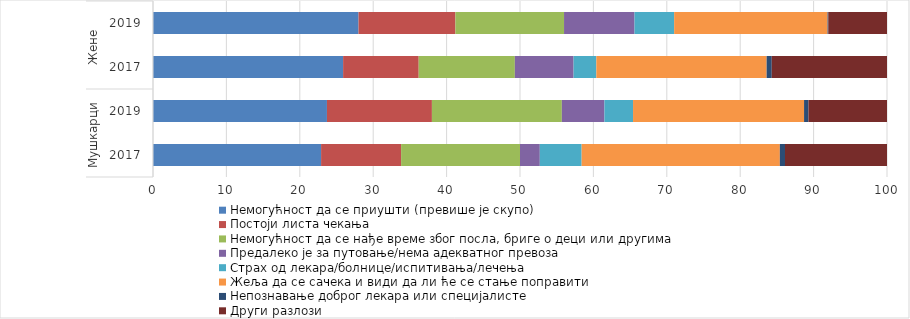
| Category | Немогућност да се приушти (превише је скупо) | Постоји листа чекања | Немогућност да се нађе време због посла, бриге о деци или другима | Предалеко је за путовање/нема адекватног превоза | Страх од лекара/болнице/испитивања/лечења | Жеља да се сачека и види да ли ће се стање поправити | Непознавање доброг лекара или специјалисте | Други разлози |
|---|---|---|---|---|---|---|---|---|
| 0 | 22.9 | 10.9 | 16.2 | 2.7 | 5.7 | 27 | 0.7 | 13.9 |
| 1 | 23.7 | 14.3 | 17.7 | 5.8 | 3.9 | 23.3 | 0.6 | 10.7 |
| 2 | 25.9 | 10.3 | 13.1 | 8 | 3.1 | 23.2 | 0.7 | 15.7 |
| 3 | 28 | 13.2 | 14.8 | 9.6 | 5.4 | 20.9 | 0.1 | 8 |